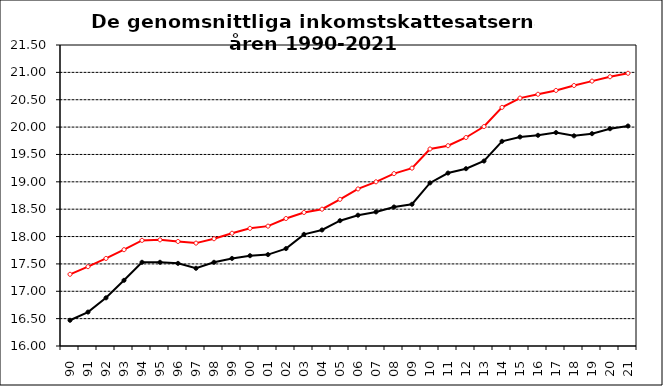
| Category | Series 2 | Series 3 |
|---|---|---|
| 90 | 16.47 | 17.31 |
| 91 | 16.62 | 17.45 |
| 92 | 16.88 | 17.6 |
| 93 | 17.2 | 17.76 |
| 94 | 17.53 | 17.93 |
| 95 | 17.53 | 17.94 |
| 96 | 17.51 | 17.91 |
| 97 | 17.42 | 17.88 |
| 98 | 17.53 | 17.96 |
| 99 | 17.6 | 18.06 |
| 00 | 17.65 | 18.15 |
| 01 | 17.67 | 18.19 |
| 02 | 17.78 | 18.33 |
| 03 | 18.04 | 18.44 |
| 04 | 18.12 | 18.5 |
| 05 | 18.29 | 18.68 |
| 06 | 18.39 | 18.87 |
| 07 | 18.45 | 19 |
| 08 | 18.54 | 19.15 |
| 09 | 18.59 | 19.25 |
| 10 | 18.98 | 19.6 |
| 11 | 19.16 | 19.66 |
| 12 | 19.24 | 19.81 |
| 13 | 19.38 | 20.01 |
| 14 | 19.74 | 20.36 |
| 15 | 19.82 | 20.53 |
| 16 | 19.85 | 20.6 |
| 17 | 19.9 | 20.67 |
| 18 | 19.84 | 20.76 |
| 19 | 19.88 | 20.84 |
| 20 | 19.97 | 20.92 |
| 21 | 20.019 | 20.983 |